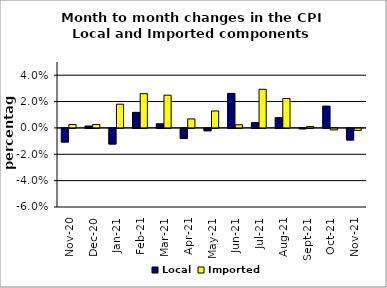
| Category | Local | Imported |
|---|---|---|
| 2020-11-01 | -0.01 | 0.003 |
| 2020-12-01 | 0.001 | 0.003 |
| 2021-01-01 | -0.012 | 0.018 |
| 2021-02-01 | 0.012 | 0.026 |
| 2021-03-01 | 0.003 | 0.025 |
| 2021-04-01 | -0.008 | 0.007 |
| 2021-05-01 | -0.002 | 0.013 |
| 2021-06-01 | 0.026 | 0.002 |
| 2021-07-01 | 0.004 | 0.029 |
| 2021-08-01 | 0.008 | 0.022 |
| 2021-09-01 | 0 | 0.001 |
| 2021-10-01 | 0.017 | -0.001 |
| 2021-11-01 | -0.009 | -0.001 |